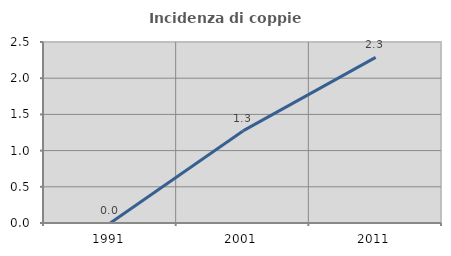
| Category | Incidenza di coppie miste |
|---|---|
| 1991.0 | 0 |
| 2001.0 | 1.272 |
| 2011.0 | 2.288 |